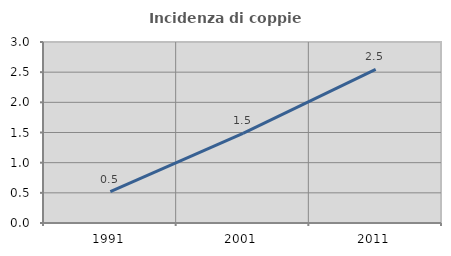
| Category | Incidenza di coppie miste |
|---|---|
| 1991.0 | 0.519 |
| 2001.0 | 1.484 |
| 2011.0 | 2.548 |